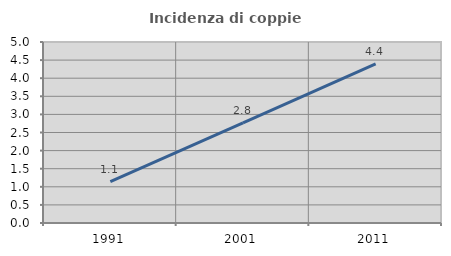
| Category | Incidenza di coppie miste |
|---|---|
| 1991.0 | 1.141 |
| 2001.0 | 2.768 |
| 2011.0 | 4.393 |